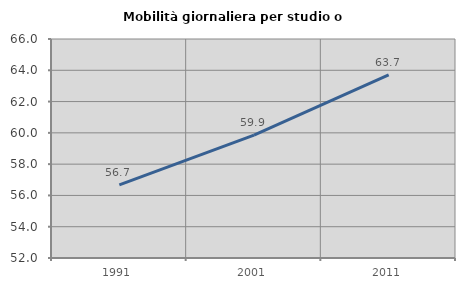
| Category | Mobilità giornaliera per studio o lavoro |
|---|---|
| 1991.0 | 56.68 |
| 2001.0 | 59.858 |
| 2011.0 | 63.703 |